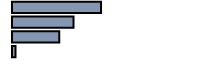
| Category | Series 0 |
|---|---|
| 0 | 44.3 |
| 1 | 30.6 |
| 2 | 23.5 |
| 3 | 1.7 |